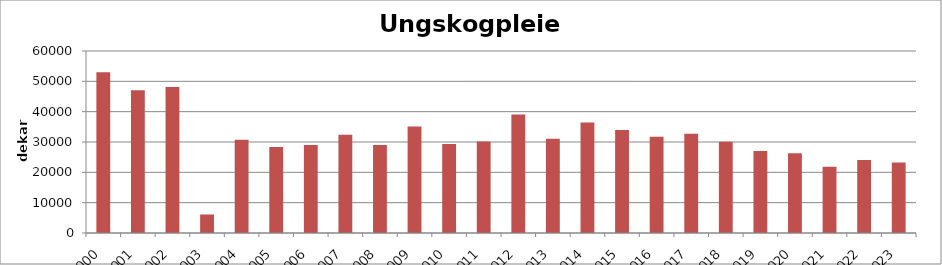
| Category | Totalt |
|---|---|
| 2000 | 53002 |
| 2001 | 47067 |
| 2002 | 48097 |
| 2003 | 6098 |
| 2004 | 30775 |
| 2005 | 28368 |
| 2006 | 29042 |
| 2007 | 32376 |
| 2008 | 29052 |
| 2009 | 35119 |
| 2010 | 29372 |
| 2011 | 30175 |
| 2012 | 39025 |
| 2013 | 31034 |
| 2014 | 36422 |
| 2015 | 33951 |
| 2016 | 31710 |
| 2017 | 32719 |
| 2018 | 30089 |
| 2019 | 27019 |
| 2020 | 26303 |
| 2021 | 21827 |
| 2022 | 24044 |
| 2023 | 23257 |